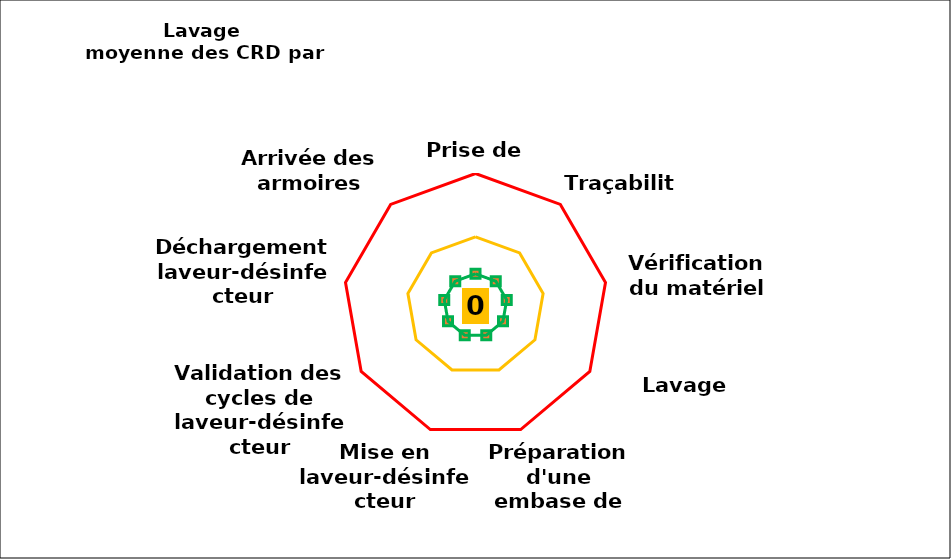
| Category | Series 0 | Series 1 | Series 2 | Series 3 |
|---|---|---|---|---|
| Prise de poste | 0 | 6 | 13 | 25 |
| Traçabilité | 0 | 6 | 13 | 25 |
| Vérification du matériel | 0 | 6 | 13 | 25 |
| Lavage manuel | 0 | 6 | 13 | 25 |
| Préparation d'une embase de lavage | 0 | 6 | 13 | 25 |
| Mise en laveur-désinfecteur | 0 | 6 | 13 | 25 |
| Validation des cycles de laveur-désinfecteur | 0 | 6 | 13 | 25 |
| Déchargement laveur-désinfecteur | 0 | 6 | 13 | 25 |
| Arrivée des armoires sales | 0 | 6 | 13 | 25 |